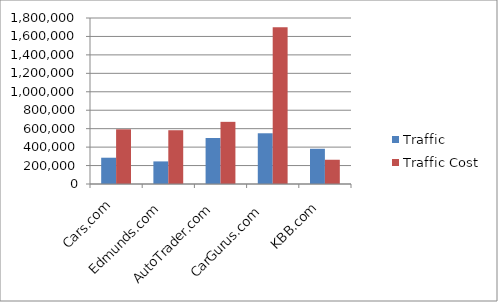
| Category | Traffic | Traffic Cost |
|---|---|---|
| Cars.com  | 285000 | 593000 |
| Edmunds.com  | 245000 | 583000 |
| AutoTrader.com   | 499000 | 674000 |
| CarGurus.com   | 550000 | 1700000 |
| KBB.com  | 382000 | 263000 |